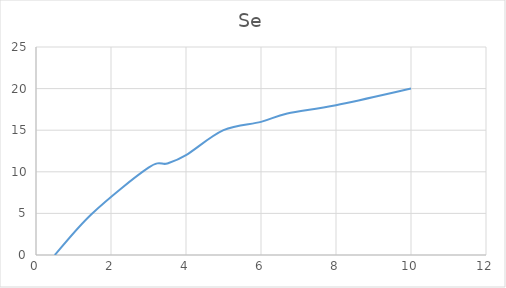
| Category | Se |
|---|---|
| 0.5 | 0 |
| 1.5 | 5 |
| 3.0 | 10.5 |
| 3.5 | 11 |
| 4.0 | 12 |
| 5.0 | 15 |
| 6.0 | 16 |
| 6.7 | 17 |
| 8.0 | 18 |
| 10.0 | 20 |